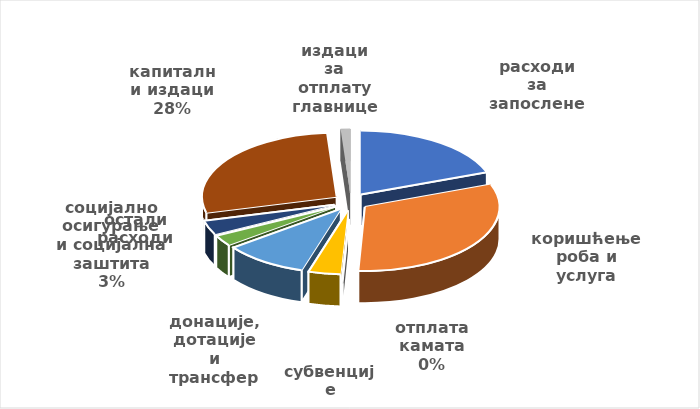
| Category | Series 0 |
|---|---|
| расходи за запослене | 122246000 |
| коришћење роба и услуга | 199214000 |
| отплата камата | 547000 |
| субвенције | 24347000 |
| донације, дотације и трансфери | 63186000 |
| социјално осигурање и социјална заштита | 17407000 |
| остали расходи | 22442000 |
| капитални издаци | 176580000 |
| издаци за отплату главнице | 7163000 |